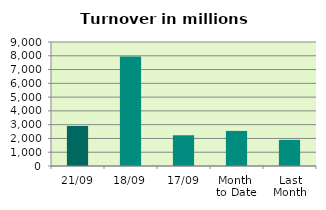
| Category | Series 0 |
|---|---|
| 21/09 | 2908.352 |
| 18/09 | 7951.016 |
| 17/09 | 2229.16 |
| Month 
to Date | 2546.13 |
| Last
Month | 1896.825 |